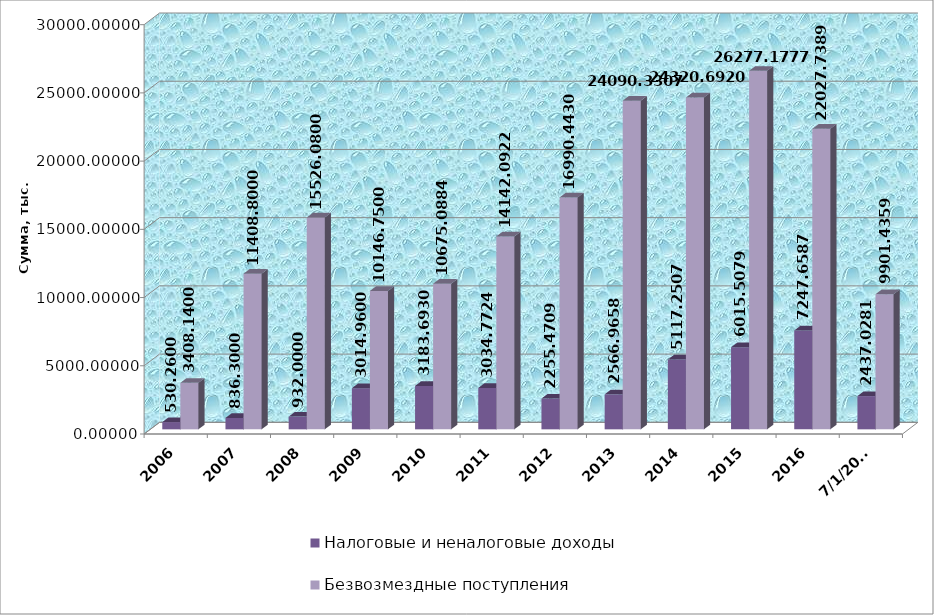
| Category | Налоговые и неналоговые доходы | Безвозмездные поступления |
|---|---|---|
| 2006.0 | 530.26 | 3408.14 |
| 2007.0 | 836.3 | 11408.8 |
| 2008.0 | 932 | 15526.08 |
| 2009.0 | 3014.96 | 10146.75 |
| 2010.0 | 3183.693 | 10675.088 |
| 2011.0 | 3034.772 | 14142.092 |
| 2012.0 | 2255.471 | 16990.443 |
| 2013.0 | 2566.966 | 24090.331 |
| 2014.0 | 5117.251 | 24320.692 |
| 2015.0 | 6015.508 | 26277.178 |
| 2016.0 | 7247.659 | 22027.739 |
| 42917.0 | 2437.028 | 9901.436 |